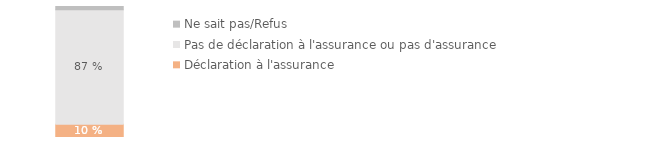
| Category | Déclaration à l'assurance | Pas de déclaration à l'assurance ou pas d'assurance | Ne sait pas/Refus |
|---|---|---|---|
|  | 0.102 | 0.873 | 0.025 |